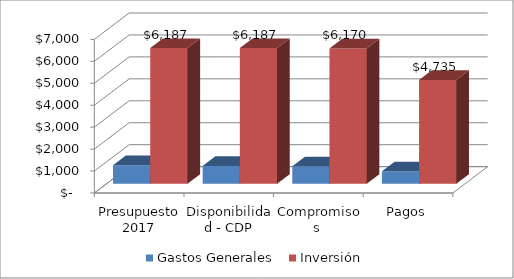
| Category | Gastos Generales  | Inversión |
|---|---|---|
| Presupuesto 2017 | 849.5 | 6186.915 |
| Disponibilidad - CDP | 812 | 6187 |
| Compromisos  | 797 | 6170 |
| Pagos | 572 | 4735 |